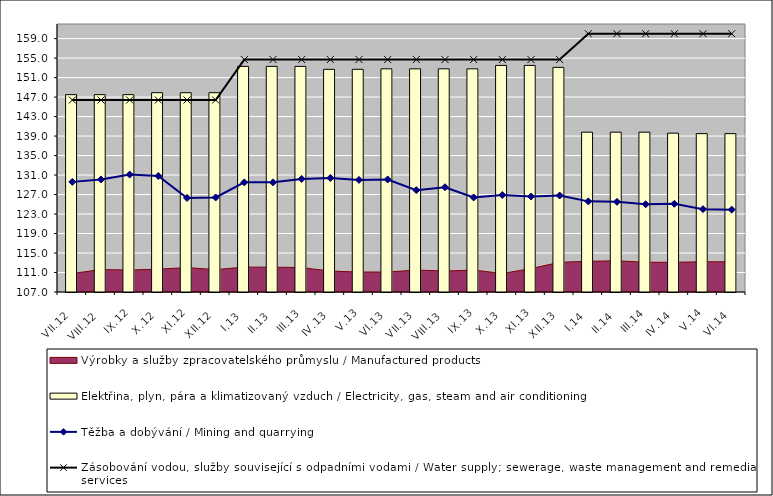
| Category | Elektřina, plyn, pára a klimatizovaný vzduch / Electricity, gas, steam and air conditioning |
|---|---|
| VII.12 | 147.5 |
| VIII.12 | 147.5 |
| IX.12 | 147.5 |
| X.12 | 147.9 |
| XI.12 | 147.9 |
| XII.12 | 147.9 |
| I.13 | 153.3 |
| II.13 | 153.3 |
| III.13 | 153.3 |
| IV.13 | 152.7 |
| V.13 | 152.7 |
| VI.13 | 152.8 |
| VII.13 | 152.8 |
| VIII.13 | 152.8 |
| IX.13 | 152.8 |
| X.13 | 153.5 |
| XI.13 | 153.5 |
| XII.13 | 153.1 |
| I.14 | 139.8 |
| II.14 | 139.8 |
| III.14 | 139.8 |
| IV.14 | 139.6 |
| V.14 | 139.5 |
| VI.14 | 139.5 |